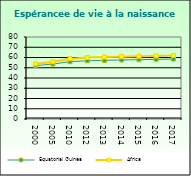
| Category | Equatorial Guinea | Africa                        |
|---|---|---|
| 2000.0 | 52.073 | 53.721 |
| 2005.0 | 53.634 | 55.757 |
| 2010.0 | 55.918 | 58.857 |
| 2012.0 | 56.835 | 59.91 |
| 2013.0 | 57.236 | 60.376 |
| 2014.0 | 57.592 | 60.801 |
| 2015.0 | 57.909 | 61.187 |
| 2016.0 | 58.197 | 61.538 |
| 2017.0 | 58.476 | 61.865 |